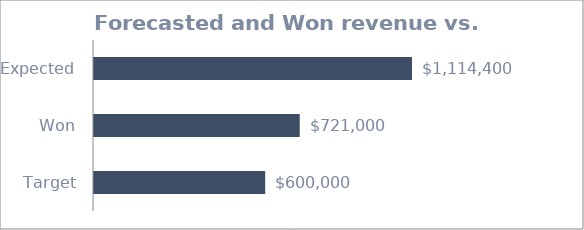
| Category | Target |
|---|---|
| Target | 600000 |
| Won | 721000 |
| Expected | 1114400 |